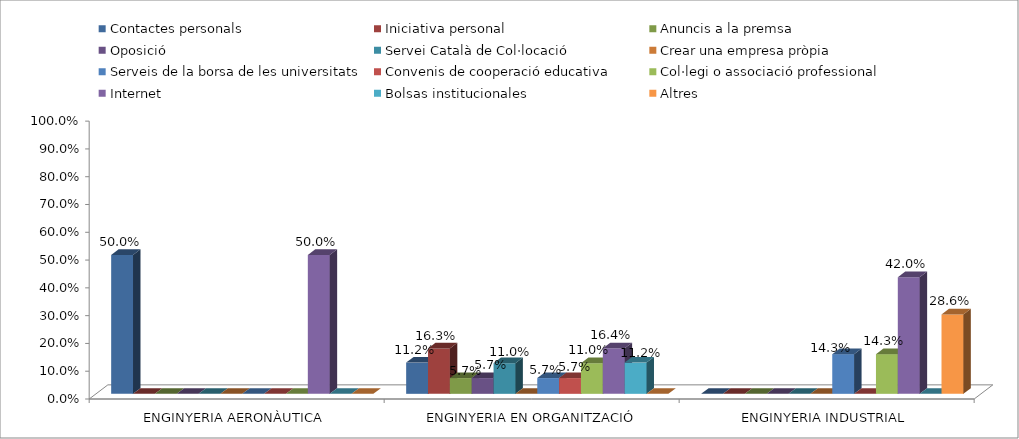
| Category | Contactes personals | Iniciativa personal | Anuncis a la premsa | Oposició | Servei Català de Col·locació | Crear una empresa pròpia | Serveis de la borsa de les universitats | Convenis de cooperació educativa | Col·legi o associació professional | Internet | Bolsas institucionales | Altres |
|---|---|---|---|---|---|---|---|---|---|---|---|---|
| ENGINYERIA AERONÀUTICA | 0.5 | 0 | 0 | 0 | 0 | 0 | 0 | 0 | 0 | 0.5 | 0 | 0 |
| ENGINYERIA EN ORGANITZACIÓ INDUSTRIAL | 0.112 | 0.163 | 0.057 | 0.057 | 0.11 | 0 | 0.057 | 0.057 | 0.11 | 0.164 | 0.112 | 0 |
| ENGINYERIA INDUSTRIAL | 0 | 0 | 0 | 0 | 0 | 0 | 0.143 | 0 | 0.143 | 0.42 | 0 | 0.286 |